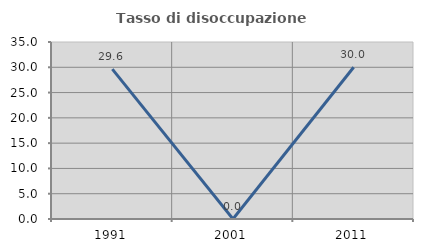
| Category | Tasso di disoccupazione giovanile  |
|---|---|
| 1991.0 | 29.63 |
| 2001.0 | 0 |
| 2011.0 | 30 |